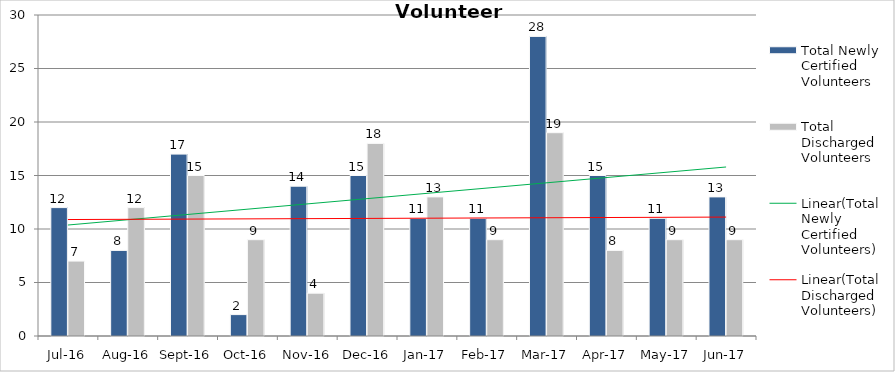
| Category | Total Newly Certified Volunteers | Total Discharged Volunteers |
|---|---|---|
| Jul-16 | 12 | 7 |
| Aug-16 | 8 | 12 |
| Sep-16 | 17 | 15 |
| Oct-16 | 2 | 9 |
| Nov-16 | 14 | 4 |
| Dec-16 | 15 | 18 |
| Jan-17 | 11 | 13 |
| Feb-17 | 11 | 9 |
| Mar-17 | 28 | 19 |
| Apr-17 | 15 | 8 |
| May-17 | 11 | 9 |
| Jun-17 | 13 | 9 |